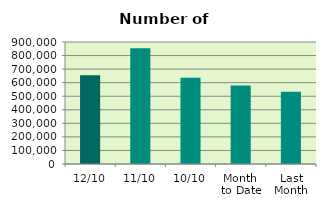
| Category | Series 0 |
|---|---|
| 12/10 | 654862 |
| 11/10 | 853062 |
| 10/10 | 636330 |
| Month 
to Date | 578457.4 |
| Last
Month | 533338.9 |